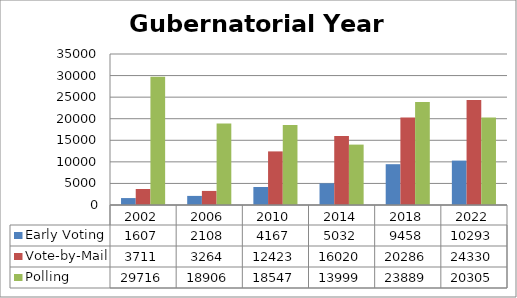
| Category | Early Voting | Vote-by-Mail | Polling |
|---|---|---|---|
| 2002.0 | 1607 | 3711 | 29716 |
| 2006.0 | 2108 | 3264 | 18906 |
| 2010.0 | 4167 | 12423 | 18547 |
| 2014.0 | 5032 | 16020 | 13999 |
| 2018.0 | 9458 | 20286 | 23889 |
| 2022.0 | 10293 | 24330 | 20305 |